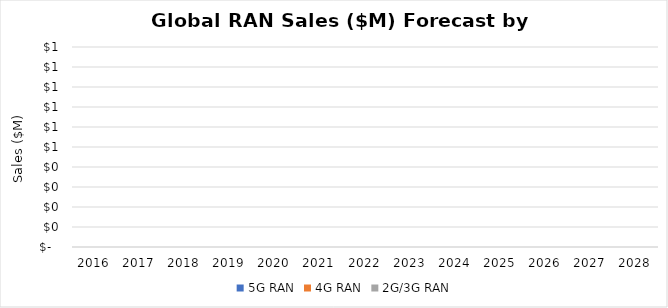
| Category | 5G RAN | 4G RAN | 2G/3G RAN |
|---|---|---|---|
| 2016.0 | 0 | 0 | 0 |
| 2017.0 | 0 | 0 | 0 |
| 2018.0 | 0 | 0 | 0 |
| 2019.0 | 0 | 0 | 0 |
| 2020.0 | 0 | 0 | 0 |
| 2021.0 | 0 | 0 | 0 |
| 2022.0 | 0 | 0 | 0 |
| 2023.0 | 0 | 0 | 0 |
| 2024.0 | 0 | 0 | 0 |
| 2025.0 | 0 | 0 | 0 |
| 2026.0 | 0 | 0 | 0 |
| 2027.0 | 0 | 0 | 0 |
| 2028.0 | 0 | 0 | 0 |